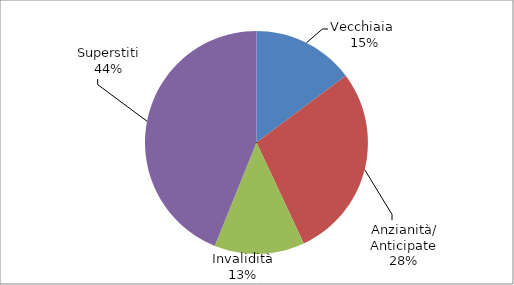
| Category | Series 0 |
|---|---|
| Vecchiaia  | 40838 |
| Anzianità/ Anticipate | 78069 |
| Invalidità | 36127 |
| Superstiti | 121258 |